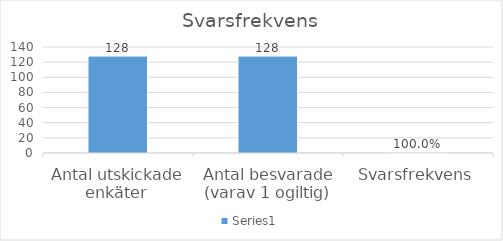
| Category | Series 0 |
|---|---|
| Antal utskickade enkäter  | 128 |
| Antal besvarade (varav 1 ogiltig) | 128 |
| Svarsfrekvens | 1 |